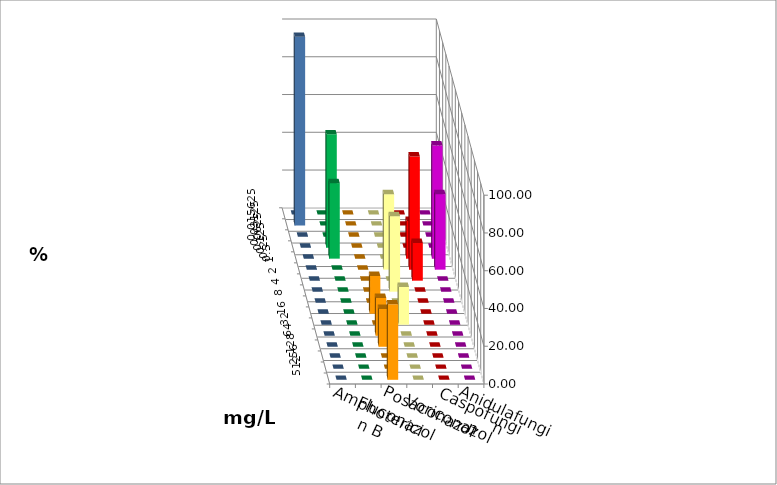
| Category | Amphotericin B | Fluconazol | Posaconazol | Voriconazol | Caspofungin | Anidulafungin |
|---|---|---|---|---|---|---|
| 0.015625 | 0 | 0 | 0 | 0 | 0 | 0 |
| 0.03125 | 0 | 0 | 0 | 0 | 0 | 100 |
| 0.0625 | 0 | 0 | 0 | 0 | 0 | 0 |
| 0.125 | 60 | 0 | 0 | 0 | 0 | 0 |
| 0.25 | 40 | 0 | 0 | 20 | 60 | 0 |
| 0.5 | 0 | 0 | 40 | 60 | 40 | 0 |
| 1.0 | 0 | 0 | 0 | 20 | 0 | 0 |
| 2.0 | 0 | 0 | 40 | 0 | 0 | 0 |
| 4.0 | 0 | 0 | 0 | 0 | 0 | 0 |
| 8.0 | 0 | 20 | 0 | 0 | 0 | 0 |
| 16.0 | 0 | 0 | 20 | 0 | 0 | 0 |
| 32.0 | 0 | 20 | 0 | 0 | 0 | 0 |
| 64.0 | 0 | 20 | 0 | 0 | 0 | 0 |
| 128.0 | 0 | 0 | 0 | 0 | 0 | 0 |
| 256.0 | 0 | 0 | 0 | 0 | 0 | 0 |
| 512.0 | 0 | 40 | 0 | 0 | 0 | 0 |